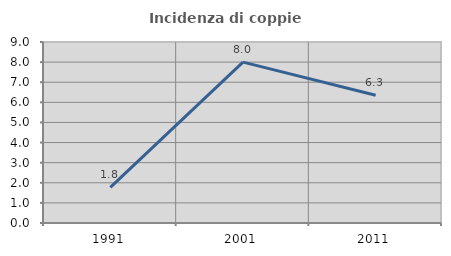
| Category | Incidenza di coppie miste |
|---|---|
| 1991.0 | 1.775 |
| 2001.0 | 8 |
| 2011.0 | 6.349 |